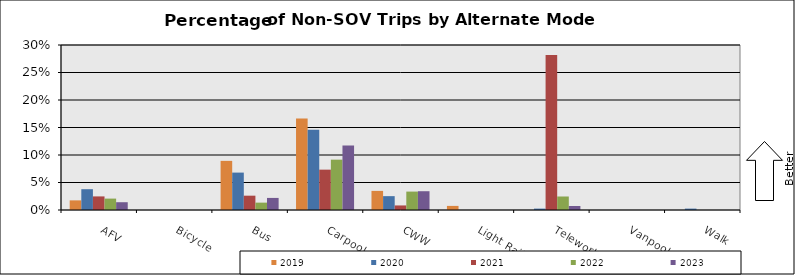
| Category | 2019 | 2020 | 2021 | 2022 | 2023 |
|---|---|---|---|---|---|
| AFV | 0.018 | 0.038 | 0.025 | 0.021 | 0.014 |
| Bicycle | 0 | 0 | 0 | 0 | 0 |
| Bus | 0.089 | 0.068 | 0.026 | 0.013 | 0.022 |
| Carpool | 0.166 | 0.146 | 0.073 | 0.092 | 0.117 |
| CWW | 0.035 | 0.025 | 0.008 | 0.033 | 0.034 |
| Light Rail | 0.007 | 0 | 0 | 0 | 0 |
| Telework | 0 | 0.003 | 0.282 | 0.025 | 0.007 |
| Vanpool | 0 | 0 | 0 | 0 | 0 |
| Walk | 0 | 0.003 | 0 | 0 | 0 |